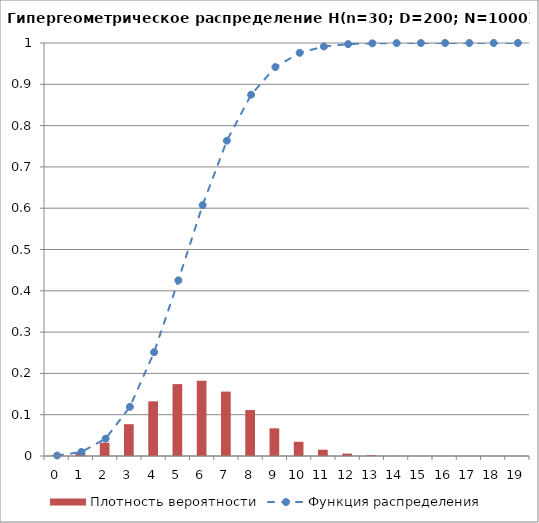
| Category | Плотность вероятности |
|---|---|
| 0.0 | 0.001 |
| 1.0 | 0.009 |
| 2.0 | 0.032 |
| 3.0 | 0.077 |
| 4.0 | 0.132 |
| 5.0 | 0.174 |
| 6.0 | 0.182 |
| 7.0 | 0.156 |
| 8.0 | 0.111 |
| 9.0 | 0.067 |
| 10.0 | 0.034 |
| 11.0 | 0.015 |
| 12.0 | 0.006 |
| 13.0 | 0.002 |
| 14.0 | 0.001 |
| 15.0 | 0 |
| 16.0 | 0 |
| 17.0 | 0 |
| 18.0 | 0 |
| 19.0 | 0 |